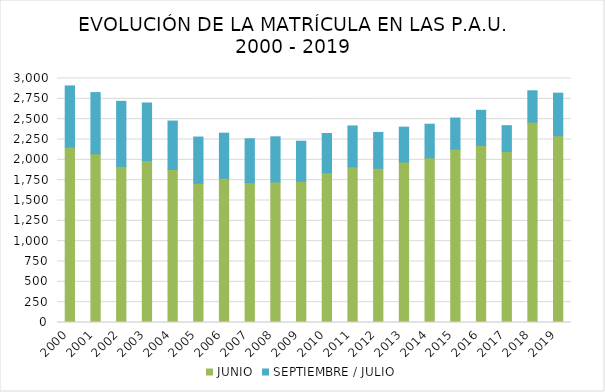
| Category | JUNIO | SEPTIEMBRE / JULIO |
|---|---|---|
| 2000.0 | 2156 | 753 |
| 2001.0 | 2075 | 752 |
| 2002.0 | 1920 | 799 |
| 2003.0 | 1991 | 708 |
| 2004.0 | 1881 | 596 |
| 2005.0 | 1712 | 568 |
| 2006.0 | 1773 | 555 |
| 2007.0 | 1719 | 540 |
| 2008.0 | 1728 | 555 |
| 2009.0 | 1737 | 492 |
| 2010.0 | 1842 | 482 |
| 2011.0 | 1915 | 502 |
| 2012.0 | 1896 | 441 |
| 2013.0 | 1973 | 429 |
| 2014.0 | 2025 | 413 |
| 2015.0 | 2132 | 382 |
| 2016.0 | 2177 | 432 |
| 2017.0 | 2101 | 319 |
| 2018.0 | 2464 | 385 |
| 2019.0 | 2296 | 524 |